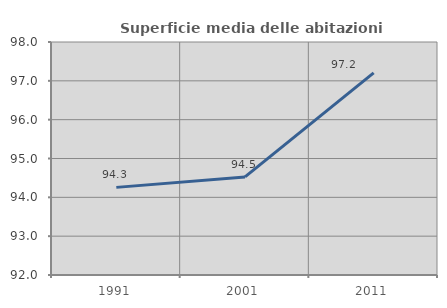
| Category | Superficie media delle abitazioni occupate |
|---|---|
| 1991.0 | 94.257 |
| 2001.0 | 94.526 |
| 2011.0 | 97.206 |